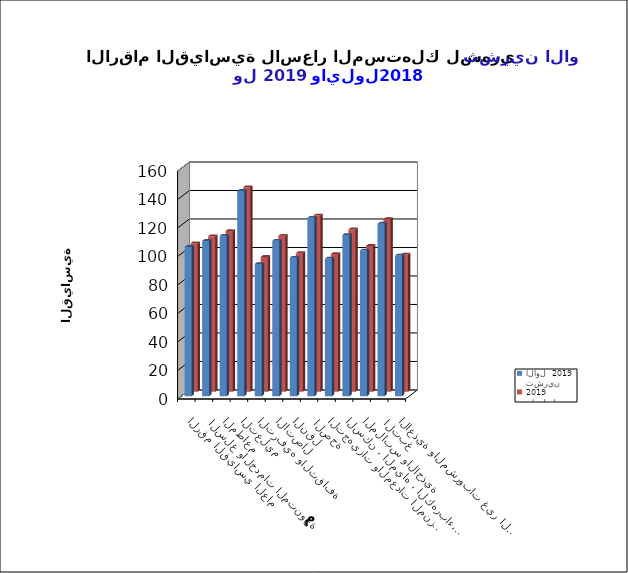
| Category | تشرين الاول  2019      |   ايلول     2019      |
|---|---|---|
| الاغذية والمشروبات غير الكحولية | 98.7 | 96.3 |
|  التبغ | 121.1 | 121.1 |
| الملابس والاحذية | 102.3 | 102.3 |
| السكن ، المياه ، الكهرباء، الغاز  | 113.1 | 113.9 |
| التجهيزات والمعدات المنزلية والصيانة | 96.6 | 96.6 |
|  الصحة | 125.2 | 123.6 |
| النقل | 97.2 | 97.2 |
| الاتصال | 109.1 | 109.4 |
| الترفيه والثقافة | 92.8 | 94.6 |
| التعليم | 144.1 | 143.5 |
| المطاعم  | 112.6 | 112.8 |
|  السلع والخدمات المتنوعة | 109 | 109.1 |
| الرقم القياسي العام | 104.8 | 104.2 |